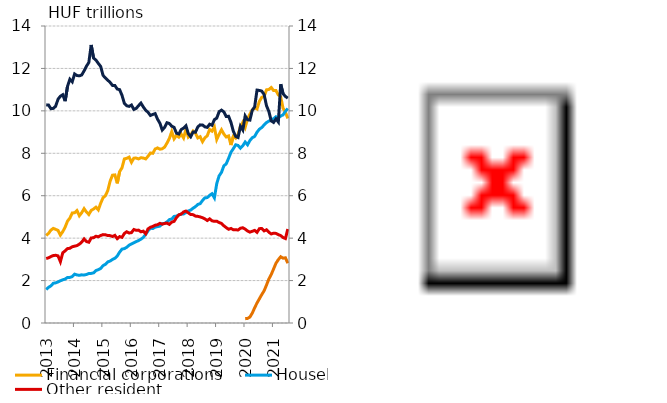
| Category | Financial corporations | Households |
|---|---|---|
| 2013-06-30 | 4.122 | 1.58 |
| 2013-07-31 | 4.225 | 1.681 |
| 2013-08-31 | 4.38 | 1.75 |
| 2013-09-30 | 4.46 | 1.872 |
| 2013-10-31 | 4.414 | 1.893 |
| 2013-11-30 | 4.366 | 1.935 |
| 2013-12-31 | 4.145 | 1.991 |
| 2014-01-31 | 4.307 | 2.036 |
| 2014-02-28 | 4.518 | 2.07 |
| 2014-03-31 | 4.802 | 2.148 |
| 2014-04-30 | 4.945 | 2.151 |
| 2014-05-31 | 5.186 | 2.186 |
| 2014-06-30 | 5.196 | 2.301 |
| 2014-07-31 | 5.299 | 2.265 |
| 2014-08-31 | 5.056 | 2.248 |
| 2014-09-30 | 5.198 | 2.27 |
| 2014-10-31 | 5.389 | 2.262 |
| 2014-11-30 | 5.23 | 2.287 |
| 2014-12-31 | 5.116 | 2.333 |
| 2015-01-31 | 5.308 | 2.336 |
| 2015-02-28 | 5.372 | 2.364 |
| 2015-03-31 | 5.46 | 2.472 |
| 2015-04-30 | 5.334 | 2.514 |
| 2015-05-31 | 5.642 | 2.57 |
| 2015-06-30 | 5.904 | 2.704 |
| 2015-07-31 | 6 | 2.766 |
| 2015-08-31 | 6.242 | 2.879 |
| 2015-09-30 | 6.688 | 2.922 |
| 2015-10-31 | 6.969 | 2.995 |
| 2015-11-30 | 6.98 | 3.051 |
| 2015-12-31 | 6.583 | 3.16 |
| 2016-01-31 | 7.134 | 3.34 |
| 2016-02-29 | 7.315 | 3.482 |
| 2016-03-31 | 7.734 | 3.506 |
| 2016-04-30 | 7.763 | 3.568 |
| 2016-05-31 | 7.819 | 3.667 |
| 2016-06-30 | 7.576 | 3.726 |
| 2016-07-31 | 7.771 | 3.779 |
| 2016-08-31 | 7.773 | 3.836 |
| 2016-09-30 | 7.734 | 3.888 |
| 2016-10-31 | 7.79 | 3.95 |
| 2016-11-30 | 7.777 | 4.034 |
| 2016-12-31 | 7.735 | 4.179 |
| 2017-01-31 | 7.861 | 4.344 |
| 2017-02-28 | 8.014 | 4.469 |
| 2017-03-31 | 7.999 | 4.451 |
| 2017-04-30 | 8.201 | 4.52 |
| 2017-05-31 | 8.254 | 4.543 |
| 2017-06-30 | 8.193 | 4.566 |
| 2017-07-31 | 8.214 | 4.683 |
| 2017-08-31 | 8.293 | 4.698 |
| 2017-09-30 | 8.482 | 4.767 |
| 2017-10-31 | 8.702 | 4.874 |
| 2017-11-30 | 9.02 | 4.902 |
| 2017-12-31 | 8.682 | 5.025 |
| 2018-01-31 | 8.841 | 5.04 |
| 2018-02-28 | 8.76 | 5.098 |
| 2018-03-31 | 8.904 | 5.132 |
| 2018-04-30 | 8.723 | 5.14 |
| 2018-05-31 | 9.132 | 5.208 |
| 2018-06-30 | 8.762 | 5.282 |
| 2018-07-31 | 8.862 | 5.324 |
| 2018-08-31 | 9.048 | 5.411 |
| 2018-09-30 | 8.951 | 5.484 |
| 2018-10-31 | 8.722 | 5.588 |
| 2018-11-30 | 8.778 | 5.625 |
| 2018-12-31 | 8.548 | 5.779 |
| 2019-01-31 | 8.728 | 5.898 |
| 2019-02-28 | 8.827 | 5.911 |
| 2019-03-31 | 9.123 | 6.018 |
| 2019-04-30 | 9.044 | 6.092 |
| 2019-05-31 | 9.238 | 5.901 |
| 2019-06-30 | 8.65 | 6.572 |
| 2019-07-31 | 8.894 | 6.935 |
| 2019-08-31 | 9.109 | 7.103 |
| 2019-09-30 | 8.908 | 7.407 |
| 2019-10-31 | 8.767 | 7.503 |
| 2019-11-30 | 8.817 | 7.764 |
| 2019-12-31 | 8.389 | 8.047 |
| 2020-01-31 | 8.798 | 8.217 |
| 2020-02-29 | 8.714 | 8.399 |
| 2020-03-31 | 8.886 | 8.369 |
| 2020-04-30 | 9.26 | 8.241 |
| 2020-05-31 | 9.465 | 8.357 |
| 2020-06-30 | 9.218 | 8.531 |
| 2020-07-31 | 9.62 | 8.4 |
| 2020-08-31 | 9.849 | 8.603 |
| 2020-09-30 | 10.044 | 8.734 |
| 2020-10-31 | 10.141 | 8.796 |
| 2020-11-30 | 10.09 | 8.995 |
| 2020-12-31 | 10.451 | 9.136 |
| 2021-01-31 | 10.638 | 9.216 |
| 2021-02-28 | 10.675 | 9.336 |
| 2021-03-31 | 10.991 | 9.447 |
| 2021-04-30 | 11.008 | 9.517 |
| 2021-05-31 | 11.1 | 9.564 |
| 2021-06-30 | 10.955 | 9.63 |
| 2021-07-31 | 10.956 | 9.723 |
| 2021-08-31 | 10.749 | 9.656 |
| 2021-09-30 | 10.663 | 9.758 |
| 2021-10-31 | 10.122 | 9.811 |
| 2021-11-30 | 9.935 | 9.979 |
| 2021-12-31 | 9.643 | 10.11 |